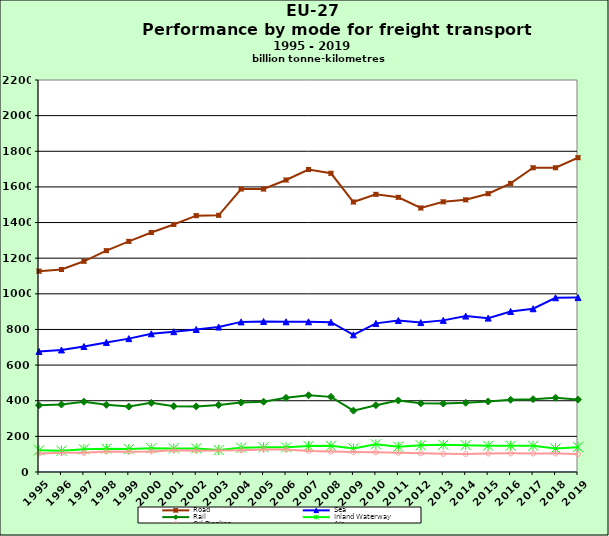
| Category | Road | Sea | Rail | Inland Waterway | Oil Pipeline | Air |
|---|---|---|---|---|---|---|
| 1995.0 | 1127.16 | 676.528 | 374.818 | 121.918 | 103.81 | 1.418 |
| 1996.0 | 1136.379 | 684.792 | 378.763 | 119.598 | 107.707 | 1.461 |
| 1997.0 | 1182.478 | 704.274 | 394.352 | 127.72 | 107.669 | 1.546 |
| 1998.0 | 1242.204 | 727.297 | 377.038 | 130.914 | 114.674 | 1.596 |
| 1999.0 | 1294.362 | 748.549 | 367.11 | 128.619 | 113.214 | 1.631 |
| 2000.0 | 1343.867 | 775.705 | 387.921 | 133.715 | 115.683 | 1.737 |
| 2001.0 | 1389.253 | 787.511 | 369.253 | 132.416 | 122.375 | 1.744 |
| 2002.0 | 1438.8 | 799.908 | 368.161 | 132.414 | 118.797 | 1.702 |
| 2003.0 | 1440.54 | 813.486 | 376.309 | 123.435 | 121.204 | 1.716 |
| 2004.0 | 1588.266 | 842.413 | 390.035 | 136.763 | 122.602 | 1.78 |
| 2005.0 | 1588.154 | 844.472 | 394.597 | 138.611 | 126.809 | 1.83 |
| 2006.0 | 1638.795 | 842.969 | 416.246 | 138.417 | 125.789 | 1.886 |
| 2007.0 | 1697.644 | 842.929 | 430.724 | 145.402 | 118.222 | 1.95 |
| 2008.0 | 1676.462 | 841.124 | 421.686 | 146.903 | 114.765 | 1.913 |
| 2009.0 | 1515.317 | 769.757 | 344.369 | 132.606 | 111.634 | 1.81 |
| 2010.0 | 1558.293 | 834.101 | 374.955 | 155.365 | 110.968 | 1.84 |
| 2011.0 | 1541.631 | 850.144 | 401.122 | 141.825 | 108.27 | 1.855 |
| 2012.0 | 1481.69 | 838.423 | 385.189 | 149.822 | 104.983 | 1.825 |
| 2013.0 | 1516.364 | 850.983 | 384.319 | 152.584 | 102.083 | 1.837 |
| 2014.0 | 1527.435 | 875.12 | 388.68 | 150.707 | 101.086 | 2.116 |
| 2015.0 | 1561.988 | 863.586 | 395.893 | 147.351 | 104.15 | 2.142 |
| 2016.0 | 1619.748 | 901.077 | 405.266 | 147.209 | 104.697 | 2.4 |
| 2017.0 | 1707.314 | 916.272 | 408.645 | 147.223 | 104.021 | 2.173 |
| 2018.0 | 1707.495 | 977.854 | 416.636 | 131.788 | 104.112 | 2.216 |
| 2019.0 | 1764.215 | 978.827 | 406.392 | 139.749 | 101.01 | 2.296 |